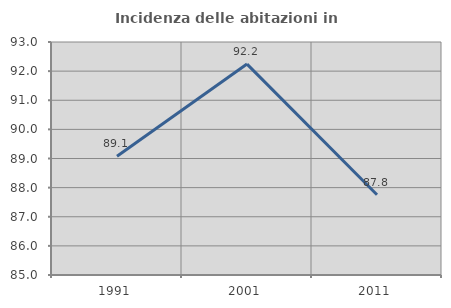
| Category | Incidenza delle abitazioni in proprietà  |
|---|---|
| 1991.0 | 89.076 |
| 2001.0 | 92.241 |
| 2011.0 | 87.755 |